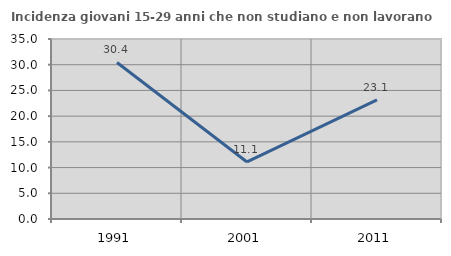
| Category | Incidenza giovani 15-29 anni che non studiano e non lavorano  |
|---|---|
| 1991.0 | 30.435 |
| 2001.0 | 11.093 |
| 2011.0 | 23.147 |